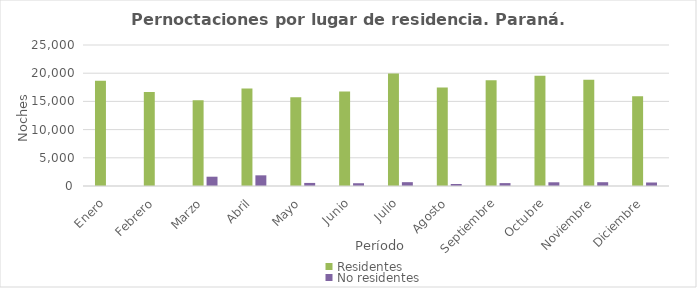
| Category | Residentes | No residentes |
|---|---|---|
| Enero | 18658 | 0 |
| Febrero | 16662 | 0 |
| Marzo | 15190 | 1648 |
| Abril | 17284 | 1892 |
| Mayo | 15744 | 545 |
| Junio | 16747 | 491 |
| Julio | 19957 | 679 |
| Agosto | 17461 | 354 |
| Septiembre | 18749 | 513 |
| Octubre | 19534 | 659 |
| Noviembre | 18847 | 672 |
| Diciembre | 15934 | 622 |